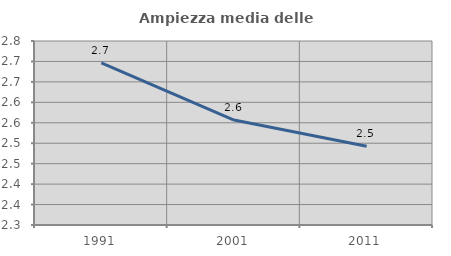
| Category | Ampiezza media delle famiglie |
|---|---|
| 1991.0 | 2.696 |
| 2001.0 | 2.557 |
| 2011.0 | 2.493 |